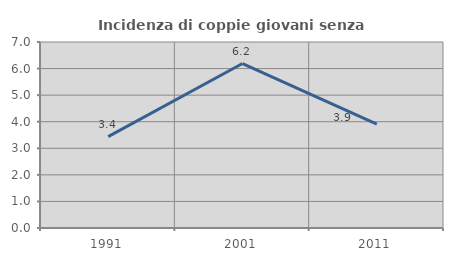
| Category | Incidenza di coppie giovani senza figli |
|---|---|
| 1991.0 | 3.436 |
| 2001.0 | 6.19 |
| 2011.0 | 3.907 |